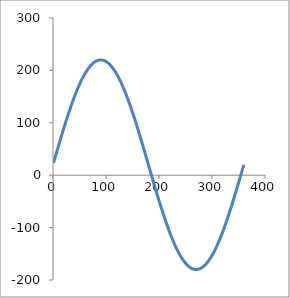
| Category | Series 0 |
|---|---|
| 219.96953903127826 | 23.49 |
| 219.87816540381914 | 26.98 |
| 219.72590695091478 | 30.467 |
| 219.51281005196483 | 33.951 |
| 219.23893961834912 | 37.431 |
| 218.90437907365467 | 40.906 |
| 218.5092303282644 | 44.374 |
| 218.05361374831406 | 47.835 |
| 217.53766811902756 | 51.287 |
| 216.9615506024416 | 54.73 |
| 216.3254366895328 | 58.162 |
| 215.62952014676114 | 61.582 |
| 214.87401295704706 | 64.99 |
| 214.0591452551993 | 68.384 |
| 213.18516525781365 | 71.764 |
| 212.25233918766378 | 75.127 |
| 211.26095119260708 | 78.474 |
| 210.2113032590307 | 81.803 |
| 209.10371511986338 | 85.114 |
| 207.9385241571817 | 88.404 |
| 206.71608529944035 | 91.674 |
| 205.4367709133575 | 94.921 |
| 204.10097069048808 | 98.146 |
| 202.70909152852016 | 101.347 |
| 201.26155740732997 | 104.524 |
| 199.7588092598334 | 107.674 |
| 198.20130483767358 | 110.798 |
| 196.5895185717854 | 113.894 |
| 194.92394142787916 | 116.962 |
| 193.20508075688775 | 120 |
| 191.43346014042245 | 123.008 |
| 189.6096192312852 | 125.984 |
| 187.7341135890848 | 128.928 |
| 185.80751451100832 | 131.839 |
| 183.83040885779835 | 134.715 |
| 181.80339887498948 | 137.557 |
| 179.72710200945858 | 140.363 |
| 177.60215072134437 | 143.132 |
| 175.42919229139417 | 145.864 |
| 173.20888862379562 | 148.558 |
| 170.9419160445544 | 151.212 |
| 168.62896509547886 | 153.826 |
| 166.2707403238341 | 156.4 |
| 163.86796006773025 | 158.932 |
| 161.4213562373095 | 161.421 |
| 158.93167409179944 | 163.868 |
| 156.3996720124997 | 166.271 |
| 153.82612127177165 | 168.629 |
| 151.21180579810147 | 170.942 |
| 148.55752193730788 | 173.209 |
| 145.8640782099675 | 175.429 |
| 143.13229506513164 | 177.602 |
| 140.36300463040968 | 179.727 |
| 137.55705045849464 | 181.803 |
| 134.71528727020922 | 183.83 |
| 131.83858069414936 | 185.808 |
| 128.9278070030054 | 187.734 |
| 125.98385284664099 | 189.61 |
| 123.00761498201084 | 191.433 |
| 120.00000000000003 | 193.205 |
| 116.96192404926742 | 194.924 |
| 113.89431255717817 | 196.59 |
| 110.79809994790936 | 198.201 |
| 107.67422935781549 | 199.759 |
| 104.52365234813989 | 201.262 |
| 101.34732861516004 | 202.709 |
| 98.14622569785475 | 204.101 |
| 94.92131868318239 | 205.437 |
| 91.67358990906007 | 206.716 |
| 88.40402866513377 | 207.939 |
| 85.11363089143136 | 209.104 |
| 81.80339887498948 | 210.211 |
| 78.47434094454735 | 211.261 |
| 75.12747116339983 | 212.252 |
| 71.76380902050414 | 213.185 |
| 68.38437911993353 | 214.059 |
| 64.99021086877298 | 214.874 |
| 61.58233816355189 | 215.63 |
| 58.161799075308984 | 216.325 |
| 54.72963553338608 | 216.962 |
| 51.286893008046185 | 217.538 |
| 47.83462019201309 | 218.054 |
| 44.3738686810295 | 218.509 |
| 40.90569265353069 | 218.904 |
| 37.43114854953163 | 219.239 |
| 33.95129474882505 | 219.513 |
| 30.467191248588794 | 219.726 |
| 26.979899340500218 | 219.878 |
| 23.49048128745672 | 219.97 |
| 20.00000000000001 | 220 |
| 16.509518712543304 | 219.97 |
| 13.020100659499809 | 219.878 |
| 9.532808751411231 | 219.726 |
| 6.048705251174933 | 219.513 |
| 2.5688514504683546 | 219.239 |
| -0.9056926535307106 | 218.904 |
| -4.3738686810294745 | 218.509 |
| -7.83462019201307 | 218.054 |
| -11.286893008046164 | 217.538 |
| -14.729635533386059 | 216.962 |
| -18.161799075308963 | 216.325 |
| -21.582338163551867 | 215.63 |
| -24.990210868773005 | 214.874 |
| -28.384379119933556 | 214.059 |
| -31.76380902050417 | 213.185 |
| -35.12747116339981 | 212.252 |
| -38.47434094454733 | 211.261 |
| -41.80339887498947 | 210.211 |
| -45.11363089143133 | 209.104 |
| -48.40402866513374 | 207.939 |
| -51.673589909060055 | 206.716 |
| -54.92131868318242 | 205.437 |
| -58.14622569785476 | 204.101 |
| -61.34732861516005 | 202.709 |
| -64.52365234813986 | 201.262 |
| -67.6742293578155 | 199.759 |
| -70.79809994790934 | 198.201 |
| -73.89431255717818 | 196.59 |
| -76.9619240492674 | 194.924 |
| -79.99999999999996 | 193.205 |
| -83.00761498201085 | 191.433 |
| -85.98385284664096 | 189.61 |
| -88.92780700300541 | 187.734 |
| -91.83858069414934 | 185.808 |
| -94.71528727020923 | 183.83 |
| -97.5570504584946 | 181.803 |
| -100.36300463040968 | 179.727 |
| -103.13229506513166 | 177.602 |
| -105.86407820996746 | 175.429 |
| -108.55752193730788 | 173.209 |
| -111.21180579810144 | 170.942 |
| -113.82612127177165 | 168.629 |
| -116.39967201249968 | 166.271 |
| -118.93167409179947 | 163.868 |
| -121.42135623730948 | 161.421 |
| -123.86796006773025 | 158.932 |
| -126.2707403238341 | 156.4 |
| -128.6289650954788 | 153.826 |
| -130.9419160445544 | 151.212 |
| -133.2088886237956 | 148.558 |
| -135.42919229139417 | 145.864 |
| -137.60215072134437 | 143.132 |
| -139.72710200945858 | 140.363 |
| -141.80339887498945 | 137.557 |
| -143.83040885779837 | 134.715 |
| -145.80751451100832 | 131.839 |
| -147.73411358908479 | 128.928 |
| -149.6096192312852 | 125.984 |
| -151.43346014042245 | 123.008 |
| -153.20508075688775 | 120 |
| -154.92394142787916 | 116.962 |
| -156.5895185717854 | 113.894 |
| -158.20130483767355 | 110.798 |
| -159.7588092598334 | 107.674 |
| -161.26155740732997 | 104.524 |
| -162.70909152852016 | 101.347 |
| -164.10097069048808 | 98.146 |
| -165.43677091335746 | 94.921 |
| -166.71608529944035 | 91.674 |
| -167.93852415718166 | 88.404 |
| -169.10371511986338 | 85.114 |
| -170.2113032590307 | 81.803 |
| -171.2609511926071 | 78.474 |
| -172.25233918766378 | 75.127 |
| -173.18516525781365 | 71.764 |
| -174.0591452551993 | 68.384 |
| -174.87401295704703 | 64.99 |
| -175.62952014676114 | 61.582 |
| -176.3254366895328 | 58.162 |
| -176.9615506024416 | 54.73 |
| -177.53766811902753 | 51.287 |
| -178.05361374831406 | 47.835 |
| -178.5092303282644 | 44.374 |
| -178.90437907365467 | 40.906 |
| -179.23893961834912 | 37.431 |
| -179.51281005196483 | 33.951 |
| -179.72590695091478 | 30.467 |
| -179.87816540381914 | 26.98 |
| -179.96953903127826 | 23.49 |
| -180.0 | 20 |
| -179.96953903127826 | 16.51 |
| -179.87816540381914 | 13.02 |
| -179.72590695091478 | 9.533 |
| -179.51281005196483 | 6.049 |
| -179.23893961834912 | 2.569 |
| -178.90437907365467 | -0.906 |
| -178.5092303282644 | -4.374 |
| -178.05361374831406 | -7.835 |
| -177.53766811902756 | -11.287 |
| -176.9615506024416 | -14.73 |
| -176.3254366895328 | -18.162 |
| -175.6295201467611 | -21.582 |
| -174.87401295704706 | -24.99 |
| -174.0591452551993 | -28.384 |
| -173.18516525781365 | -31.764 |
| -172.25233918766378 | -35.127 |
| -171.26095119260708 | -38.474 |
| -170.21130325903073 | -41.803 |
| -169.10371511986335 | -45.114 |
| -167.9385241571817 | -48.404 |
| -166.71608529944035 | -51.674 |
| -165.4367709133575 | -54.921 |
| -164.10097069048808 | -58.146 |
| -162.70909152852016 | -61.347 |
| -161.26155740733 | -64.524 |
| -159.75880925983338 | -67.674 |
| -158.20130483767358 | -70.798 |
| -156.58951857178536 | -73.894 |
| -154.92394142787916 | -76.962 |
| -153.20508075688772 | -80 |
| -151.43346014042245 | -83.008 |
| -149.60961923128522 | -85.984 |
| -147.7341135890848 | -88.928 |
| -145.80751451100838 | -91.839 |
| -143.83040885779835 | -94.715 |
| -141.8033988749895 | -97.557 |
| -139.72710200945858 | -100.363 |
| -137.6021507213444 | -103.132 |
| -135.42919229139414 | -105.864 |
| -133.20888862379562 | -108.558 |
| -130.94191604455443 | -111.212 |
| -128.62896509547886 | -113.826 |
| -126.2707403238341 | -116.4 |
| -123.86796006773022 | -118.932 |
| -121.42135623730954 | -121.421 |
| -118.93167409179944 | -123.868 |
| -116.3996720124997 | -126.271 |
| -113.82612127177163 | -128.629 |
| -111.21180579810147 | -130.942 |
| -108.55752193730788 | -133.209 |
| -105.86407820996757 | -135.429 |
| -103.13229506513161 | -137.602 |
| -100.36300463040965 | -139.727 |
| -97.55705045849464 | -141.803 |
| -94.71528727020927 | -143.83 |
| -91.83858069414931 | -145.808 |
| -88.9278070030054 | -147.734 |
| -85.983852846641 | -149.61 |
| -83.00761498201089 | -151.433 |
| -80.00000000000009 | -153.205 |
| -76.96192404926737 | -154.924 |
| -73.89431255717815 | -156.59 |
| -70.79809994790938 | -158.201 |
| -67.67422935781555 | -159.759 |
| -64.52365234813983 | -161.262 |
| -61.34732861516002 | -162.709 |
| -58.14622569785476 | -164.101 |
| -54.92131868318246 | -165.437 |
| -51.67358990906014 | -166.716 |
| -48.40402866513371 | -167.939 |
| -45.11363089143133 | -169.104 |
| -41.80339887498951 | -170.211 |
| -38.47434094454742 | -171.261 |
| -35.127471163399775 | -172.252 |
| -31.763809020504127 | -173.185 |
| -28.384379119933556 | -174.059 |
| -24.990210868773048 | -174.874 |
| -21.58233816355196 | -175.63 |
| -18.16179907530892 | -176.325 |
| -14.729635533386066 | -176.962 |
| -11.286893008046206 | -177.538 |
| -7.8346201920131655 | -178.054 |
| -4.373868681029435 | -178.509 |
| -0.9056926535306715 | -178.904 |
| 2.568851450468351 | -179.239 |
| 6.048705251174884 | -179.513 |
| 9.532808751411139 | -179.726 |
| 13.020100659499848 | -179.878 |
| 16.5095187125433 | -179.97 |
| 19.999999999999964 | -180 |
| 23.490481287456625 | -179.97 |
| 26.979899340500257 | -179.878 |
| 30.46719124858879 | -179.726 |
| 33.95129474882504 | -179.513 |
| 37.43114854953158 | -179.239 |
| 40.90569265353059 | -178.904 |
| 44.373868681029535 | -178.509 |
| 47.83462019201309 | -178.054 |
| 51.286893008046135 | -177.538 |
| 54.729635533385995 | -176.962 |
| 58.16179907530902 | -176.325 |
| 61.58233816355189 | -175.63 |
| 64.99021086877298 | -174.874 |
| 68.3843791199335 | -174.059 |
| 71.76380902050406 | -173.185 |
| 75.12747116339987 | -172.252 |
| 78.47434094454735 | -171.261 |
| 81.80339887498945 | -170.211 |
| 85.11363089143126 | -169.104 |
| 88.4040286651338 | -167.939 |
| 91.67358990906007 | -166.716 |
| 94.92131868318239 | -165.437 |
| 98.1462256978547 | -164.101 |
| 101.34732861515995 | -162.709 |
| 104.52365234813992 | -161.262 |
| 107.67422935781548 | -159.759 |
| 110.79809994790932 | -158.201 |
| 113.89431255717808 | -156.59 |
| 116.96192404926745 | -154.924 |
| 120.00000000000003 | -153.205 |
| 123.00761498201084 | -151.433 |
| 125.98385284664093 | -149.61 |
| 128.92780700300534 | -147.734 |
| 131.8385806941494 | -145.808 |
| 134.71528727020922 | -143.83 |
| 137.5570504584946 | -141.803 |
| 140.3630046304096 | -139.727 |
| 143.1322950651317 | -137.602 |
| 145.8640782099675 | -135.429 |
| 148.55752193730785 | -133.209 |
| 151.2118057981014 | -130.942 |
| 153.82612127177157 | -128.629 |
| 156.3996720124997 | -126.271 |
| 158.93167409179944 | -123.868 |
| 161.42135623730948 | -121.421 |
| 163.86796006773017 | -118.932 |
| 166.27074032383413 | -116.4 |
| 168.62896509547886 | -113.826 |
| 170.94191604455438 | -111.212 |
| 173.20888862379556 | -108.558 |
| 175.42919229139412 | -105.864 |
| 177.6021507213444 | -103.132 |
| 179.72710200945858 | -100.363 |
| 181.80339887498945 | -97.557 |
| 183.83040885779832 | -94.715 |
| 185.80751451100838 | -91.839 |
| 187.7341135890848 | -88.928 |
| 189.6096192312852 | -85.984 |
| 191.43346014042243 | -83.008 |
| 193.20508075688767 | -80 |
| 194.92394142787916 | -76.962 |
| 196.58951857178536 | -73.894 |
| 198.20130483767355 | -70.798 |
| 199.75880925983336 | -67.674 |
| 201.26155740733 | -64.524 |
| 202.7090915285202 | -61.347 |
| 204.10097069048805 | -58.146 |
| 205.43677091335746 | -54.921 |
| 206.7160852994403 | -51.674 |
| 207.9385241571817 | -48.404 |
| 209.10371511986338 | -45.114 |
| 210.2113032590307 | -41.803 |
| 211.26095119260705 | -38.474 |
| 212.25233918766378 | -35.127 |
| 213.18516525781365 | -31.764 |
| 214.0591452551993 | -28.384 |
| 214.87401295704703 | -24.99 |
| 215.6295201467611 | -21.582 |
| 216.3254366895328 | -18.162 |
| 216.9615506024416 | -14.73 |
| 217.53766811902753 | -11.287 |
| 218.05361374831406 | -7.835 |
| 218.5092303282644 | -4.374 |
| 218.90437907365467 | -0.906 |
| 219.23893961834912 | 2.569 |
| 219.51281005196483 | 6.049 |
| 219.72590695091478 | 9.533 |
| 219.87816540381914 | 13.02 |
| 219.96953903127826 | 16.51 |
| 220.0 | 20 |